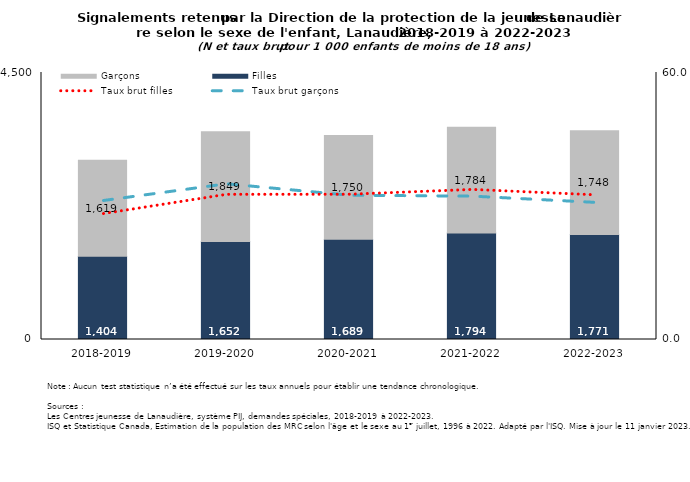
| Category | Filles | Garçons |
|---|---|---|
| 2018-2019 | 1404 | 1619 |
| 2019-2020 | 1652 | 1849 |
| 2020-2021 | 1689 | 1750 |
| 2021-2022 | 1794 | 1784 |
| 2022-2023 | 1771 | 1748 |